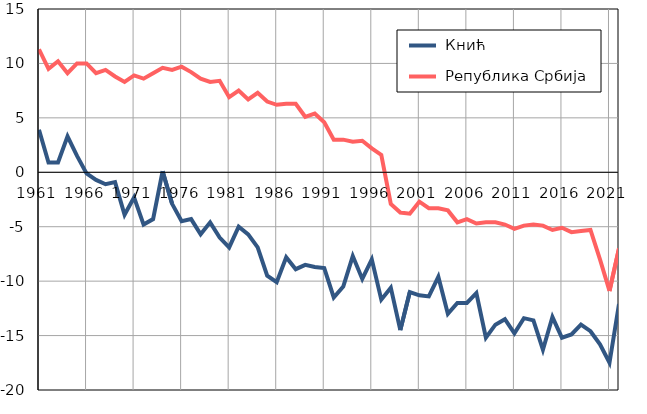
| Category |  Кнић |  Република Србија |
|---|---|---|
| 1961.0 | 3.9 | 11.3 |
| 1962.0 | 0.9 | 9.5 |
| 1963.0 | 0.9 | 10.2 |
| 1964.0 | 3.3 | 9.1 |
| 1965.0 | 1.5 | 10 |
| 1966.0 | -0.1 | 10 |
| 1967.0 | -0.7 | 9.1 |
| 1968.0 | -1.1 | 9.4 |
| 1969.0 | -0.9 | 8.8 |
| 1970.0 | -3.9 | 8.3 |
| 1971.0 | -2.3 | 8.9 |
| 1972.0 | -4.8 | 8.6 |
| 1973.0 | -4.3 | 9.1 |
| 1974.0 | 0.1 | 9.6 |
| 1975.0 | -2.9 | 9.4 |
| 1976.0 | -4.5 | 9.7 |
| 1977.0 | -4.3 | 9.2 |
| 1978.0 | -5.7 | 8.6 |
| 1979.0 | -4.6 | 8.3 |
| 1980.0 | -6 | 8.4 |
| 1981.0 | -6.9 | 6.9 |
| 1982.0 | -5 | 7.5 |
| 1983.0 | -5.7 | 6.7 |
| 1984.0 | -6.9 | 7.3 |
| 1985.0 | -9.5 | 6.5 |
| 1986.0 | -10.1 | 6.2 |
| 1987.0 | -7.8 | 6.3 |
| 1988.0 | -8.9 | 6.3 |
| 1989.0 | -8.5 | 5.1 |
| 1990.0 | -8.7 | 5.4 |
| 1991.0 | -8.8 | 4.6 |
| 1992.0 | -11.5 | 3 |
| 1993.0 | -10.5 | 3 |
| 1994.0 | -7.7 | 2.8 |
| 1995.0 | -9.8 | 2.9 |
| 1996.0 | -8 | 2.2 |
| 1997.0 | -11.7 | 1.6 |
| 1998.0 | -10.6 | -2.9 |
| 1999.0 | -14.5 | -3.7 |
| 2000.0 | -11 | -3.8 |
| 2001.0 | -11.3 | -2.7 |
| 2002.0 | -11.4 | -3.3 |
| 2003.0 | -9.6 | -3.3 |
| 2004.0 | -13 | -3.5 |
| 2005.0 | -12 | -4.6 |
| 2006.0 | -12 | -4.3 |
| 2007.0 | -11.1 | -4.7 |
| 2008.0 | -15.2 | -4.6 |
| 2009.0 | -14 | -4.6 |
| 2010.0 | -13.5 | -4.8 |
| 2011.0 | -14.8 | -5.2 |
| 2012.0 | -13.4 | -4.9 |
| 2013.0 | -13.6 | -4.8 |
| 2014.0 | -16.3 | -4.9 |
| 2015.0 | -13.3 | -5.3 |
| 2016.0 | -15.2 | -5.1 |
| 2017.0 | -14.9 | -5.5 |
| 2018.0 | -14 | -5.4 |
| 2019.0 | -14.6 | -5.3 |
| 2020.0 | -15.8 | -8 |
| 2021.0 | -17.5 | -10.9 |
| 2022.0 | -12.1 | -7 |